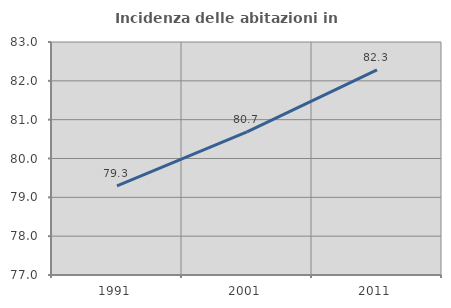
| Category | Incidenza delle abitazioni in proprietà  |
|---|---|
| 1991.0 | 79.293 |
| 2001.0 | 80.687 |
| 2011.0 | 82.283 |